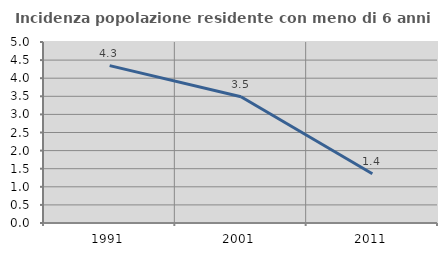
| Category | Incidenza popolazione residente con meno di 6 anni |
|---|---|
| 1991.0 | 4.348 |
| 2001.0 | 3.488 |
| 2011.0 | 1.361 |